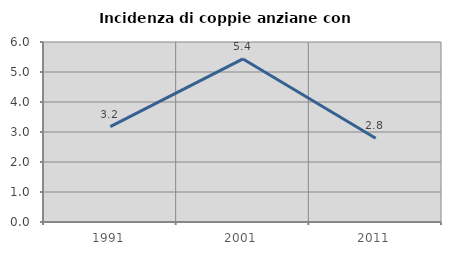
| Category | Incidenza di coppie anziane con figli |
|---|---|
| 1991.0 | 3.182 |
| 2001.0 | 5.435 |
| 2011.0 | 2.793 |